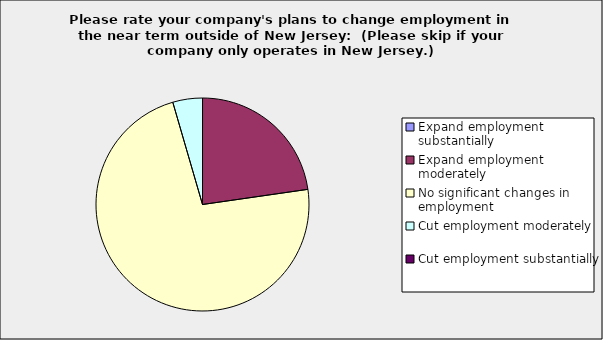
| Category | Series 0 |
|---|---|
| Expand employment substantially | 0 |
| Expand employment moderately | 0.227 |
| No significant changes in employment | 0.727 |
| Cut employment moderately | 0.045 |
| Cut employment substantially | 0 |